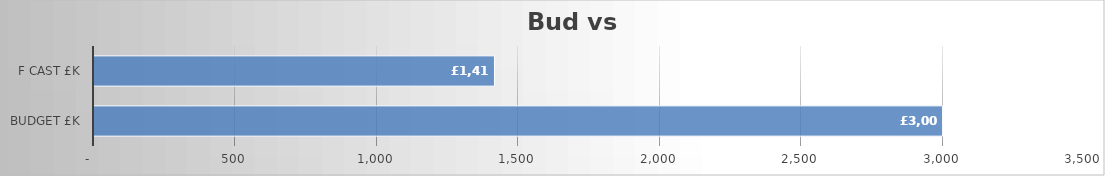
| Category | Series 0 |
|---|---|
| Budget £k | 3000 |
| F cast £k | 1415.764 |